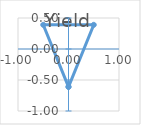
| Category | Yield |
|---|---|
| 0.0 | -0.61 |
| 0.5 | 0.39 |
| -0.5 | 0.39 |
| 0.0 | -0.61 |